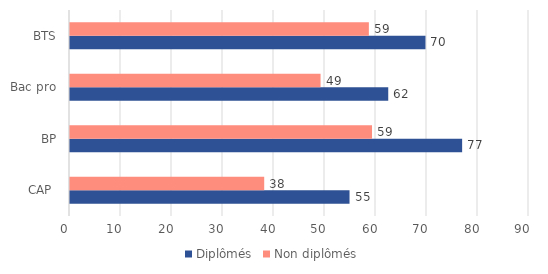
| Category | Diplômés | Non diplômés |
|---|---|---|
| CAP  | 54.81 | 38.08 |
| BP | 76.89 | 59.22 |
| Bac pro | 62.4 | 49.13 |
| BTS | 69.7 | 58.6 |